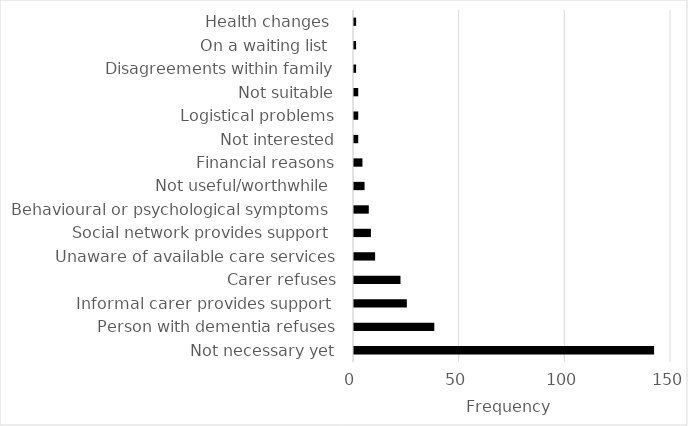
| Category | Reasons for not using formal care services |
|---|---|
| Not necessary yet | 142 |
| Person with dementia refuses | 38 |
| Informal carer provides support  | 25 |
| Carer refuses | 22 |
| Unaware of available care services | 10 |
| Social network provides support  | 8 |
| Behavioural or psychological symptoms  | 7 |
| Not useful/worthwhile  | 5 |
| Financial reasons | 4 |
| Not interested | 2 |
| Logistical problems | 2 |
| Not suitable | 2 |
| Disagreements within family | 1 |
| On a waiting list  | 1 |
| Health changes  | 1 |